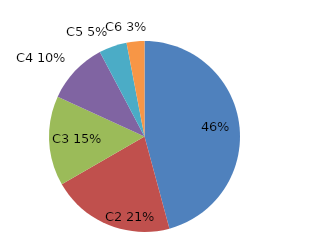
| Category | Series 0 |
|---|---|
| C1 | 0.458 |
| C2 | 0.209 |
| C3 | 0.152 |
| C4 | 0.104 |
| C5 | 0.047 |
| C6 | 0.03 |